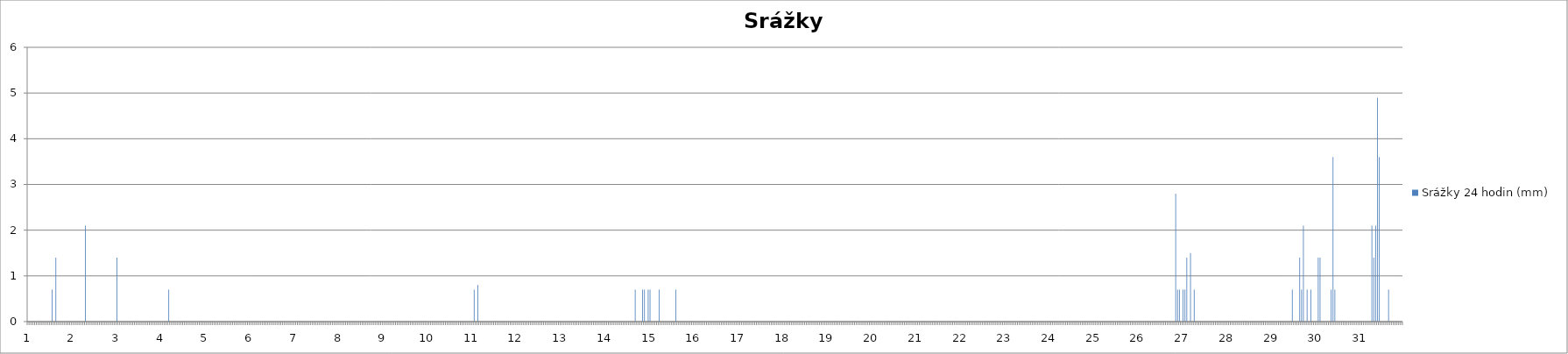
| Category | Srážky 24 hodin (mm) |
|---|---|
| 0 | 0 |
| 1 | 0 |
| 2 | 0 |
| 3 | 0 |
| 4 | 0 |
| 5 | 0 |
| 6 | 0 |
| 7 | 0 |
| 8 | 0 |
| 9 | 0 |
| 10 | 0 |
| 11 | 0 |
| 12 | 0 |
| 13 | 0.7 |
| 14 | 0 |
| 15 | 1.4 |
| 16 | 0 |
| 17 | 0 |
| 18 | 0 |
| 19 | 0 |
| 20 | 0 |
| 21 | 0 |
| 22 | 0 |
| 23 | 0 |
| 24 | 0 |
| 25 | 0 |
| 26 | 0 |
| 27 | 0 |
| 28 | 0 |
| 29 | 0 |
| 30 | 0 |
| 31 | 2.1 |
| 32 | 0 |
| 33 | 0 |
| 34 | 0 |
| 35 | 0 |
| 36 | 0 |
| 37 | 0 |
| 38 | 0 |
| 39 | 0 |
| 40 | 0 |
| 41 | 0 |
| 42 | 0 |
| 43 | 0 |
| 44 | 0 |
| 45 | 0 |
| 46 | 0 |
| 47 | 0 |
| 48 | 1.4 |
| 49 | 0 |
| 50 | 0 |
| 51 | 0 |
| 52 | 0 |
| 53 | 0 |
| 54 | 0 |
| 55 | 0 |
| 56 | 0 |
| 57 | 0 |
| 58 | 0 |
| 59 | 0 |
| 60 | 0 |
| 61 | 0 |
| 62 | 0 |
| 63 | 0 |
| 64 | 0 |
| 65 | 0 |
| 66 | 0 |
| 67 | 0 |
| 68 | 0 |
| 69 | 0 |
| 70 | 0 |
| 71 | 0 |
| 72 | 0 |
| 73 | 0 |
| 74 | 0 |
| 75 | 0 |
| 76 | 0.7 |
| 77 | 0 |
| 78 | 0 |
| 79 | 0 |
| 80 | 0 |
| 81 | 0 |
| 82 | 0 |
| 83 | 0 |
| 84 | 0 |
| 85 | 0 |
| 86 | 0 |
| 87 | 0 |
| 88 | 0 |
| 89 | 0 |
| 90 | 0 |
| 91 | 0 |
| 92 | 0 |
| 93 | 0 |
| 94 | 0 |
| 95 | 0 |
| 96 | 0 |
| 97 | 0 |
| 98 | 0 |
| 99 | 0 |
| 100 | 0 |
| 101 | 0 |
| 102 | 0 |
| 103 | 0 |
| 104 | 0 |
| 105 | 0 |
| 106 | 0 |
| 107 | 0 |
| 108 | 0 |
| 109 | 0 |
| 110 | 0 |
| 111 | 0 |
| 112 | 0 |
| 113 | 0 |
| 114 | 0 |
| 115 | 0 |
| 116 | 0 |
| 117 | 0 |
| 118 | 0 |
| 119 | 0 |
| 120 | 0 |
| 121 | 0 |
| 122 | 0 |
| 123 | 0 |
| 124 | 0 |
| 125 | 0 |
| 126 | 0 |
| 127 | 0 |
| 128 | 0 |
| 129 | 0 |
| 130 | 0 |
| 131 | 0 |
| 132 | 0 |
| 133 | 0 |
| 134 | 0 |
| 135 | 0 |
| 136 | 0 |
| 137 | 0 |
| 138 | 0 |
| 139 | 0 |
| 140 | 0 |
| 141 | 0 |
| 142 | 0 |
| 143 | 0 |
| 144 | 0 |
| 145 | 0 |
| 146 | 0 |
| 147 | 0 |
| 148 | 0 |
| 149 | 0 |
| 150 | 0 |
| 151 | 0 |
| 152 | 0 |
| 153 | 0 |
| 154 | 0 |
| 155 | 0 |
| 156 | 0 |
| 157 | 0 |
| 158 | 0 |
| 159 | 0 |
| 160 | 0 |
| 161 | 0 |
| 162 | 0 |
| 163 | 0 |
| 164 | 0 |
| 165 | 0 |
| 166 | 0 |
| 167 | 0 |
| 168 | 0 |
| 169 | 0 |
| 170 | 0 |
| 171 | 0 |
| 172 | 0 |
| 173 | 0 |
| 174 | 0 |
| 175 | 0 |
| 176 | 0 |
| 177 | 0 |
| 178 | 0 |
| 179 | 0 |
| 180 | 0 |
| 181 | 0 |
| 182 | 0 |
| 183 | 0 |
| 184 | 0 |
| 185 | 0 |
| 186 | 0 |
| 187 | 0 |
| 188 | 0 |
| 189 | 0 |
| 190 | 0 |
| 191 | 0 |
| 192 | 0 |
| 193 | 0 |
| 194 | 0 |
| 195 | 0 |
| 196 | 0 |
| 197 | 0 |
| 198 | 0 |
| 199 | 0 |
| 200 | 0 |
| 201 | 0 |
| 202 | 0 |
| 203 | 0 |
| 204 | 0 |
| 205 | 0 |
| 206 | 0 |
| 207 | 0 |
| 208 | 0 |
| 209 | 0 |
| 210 | 0 |
| 211 | 0 |
| 212 | 0 |
| 213 | 0 |
| 214 | 0 |
| 215 | 0 |
| 216 | 0 |
| 217 | 0 |
| 218 | 0 |
| 219 | 0 |
| 220 | 0 |
| 221 | 0 |
| 222 | 0 |
| 223 | 0 |
| 224 | 0 |
| 225 | 0 |
| 226 | 0 |
| 227 | 0 |
| 228 | 0 |
| 229 | 0 |
| 230 | 0 |
| 231 | 0 |
| 232 | 0 |
| 233 | 0 |
| 234 | 0 |
| 235 | 0 |
| 236 | 0 |
| 237 | 0 |
| 238 | 0 |
| 239 | 0 |
| 240 | 0 |
| 241 | 0.7 |
| 242 | 0 |
| 243 | 0.8 |
| 244 | 0 |
| 245 | 0 |
| 246 | 0 |
| 247 | 0 |
| 248 | 0 |
| 249 | 0 |
| 250 | 0 |
| 251 | 0 |
| 252 | 0 |
| 253 | 0 |
| 254 | 0 |
| 255 | 0 |
| 256 | 0 |
| 257 | 0 |
| 258 | 0 |
| 259 | 0 |
| 260 | 0 |
| 261 | 0 |
| 262 | 0 |
| 263 | 0 |
| 264 | 0 |
| 265 | 0 |
| 266 | 0 |
| 267 | 0 |
| 268 | 0 |
| 269 | 0 |
| 270 | 0 |
| 271 | 0 |
| 272 | 0 |
| 273 | 0 |
| 274 | 0 |
| 275 | 0 |
| 276 | 0 |
| 277 | 0 |
| 278 | 0 |
| 279 | 0 |
| 280 | 0 |
| 281 | 0 |
| 282 | 0 |
| 283 | 0 |
| 284 | 0 |
| 285 | 0 |
| 286 | 0 |
| 287 | 0 |
| 288 | 0 |
| 289 | 0 |
| 290 | 0 |
| 291 | 0 |
| 292 | 0 |
| 293 | 0 |
| 294 | 0 |
| 295 | 0 |
| 296 | 0 |
| 297 | 0 |
| 298 | 0 |
| 299 | 0 |
| 300 | 0 |
| 301 | 0 |
| 302 | 0 |
| 303 | 0 |
| 304 | 0 |
| 305 | 0 |
| 306 | 0 |
| 307 | 0 |
| 308 | 0 |
| 309 | 0 |
| 310 | 0 |
| 311 | 0 |
| 312 | 0 |
| 313 | 0 |
| 314 | 0 |
| 315 | 0 |
| 316 | 0 |
| 317 | 0 |
| 318 | 0 |
| 319 | 0 |
| 320 | 0 |
| 321 | 0 |
| 322 | 0 |
| 323 | 0 |
| 324 | 0 |
| 325 | 0 |
| 326 | 0 |
| 327 | 0 |
| 328 | 0.7 |
| 329 | 0 |
| 330 | 0 |
| 331 | 0 |
| 332 | 0.7 |
| 333 | 0.7 |
| 334 | 0 |
| 335 | 0.7 |
| 336 | 0.7 |
| 337 | 0 |
| 338 | 0 |
| 339 | 0 |
| 340 | 0 |
| 341 | 0.7 |
| 342 | 0 |
| 343 | 0 |
| 344 | 0 |
| 345 | 0 |
| 346 | 0 |
| 347 | 0 |
| 348 | 0 |
| 349 | 0 |
| 350 | 0.7 |
| 351 | 0 |
| 352 | 0 |
| 353 | 0 |
| 354 | 0 |
| 355 | 0 |
| 356 | 0 |
| 357 | 0 |
| 358 | 0 |
| 359 | 0 |
| 360 | 0 |
| 361 | 0 |
| 362 | 0 |
| 363 | 0 |
| 364 | 0 |
| 365 | 0 |
| 366 | 0 |
| 367 | 0 |
| 368 | 0 |
| 369 | 0 |
| 370 | 0 |
| 371 | 0 |
| 372 | 0 |
| 373 | 0 |
| 374 | 0 |
| 375 | 0 |
| 376 | 0 |
| 377 | 0 |
| 378 | 0 |
| 379 | 0 |
| 380 | 0 |
| 381 | 0 |
| 382 | 0 |
| 383 | 0 |
| 384 | 0 |
| 385 | 0 |
| 386 | 0 |
| 387 | 0 |
| 388 | 0 |
| 389 | 0 |
| 390 | 0 |
| 391 | 0 |
| 392 | 0 |
| 393 | 0 |
| 394 | 0 |
| 395 | 0 |
| 396 | 0 |
| 397 | 0 |
| 398 | 0 |
| 399 | 0 |
| 400 | 0 |
| 401 | 0 |
| 402 | 0 |
| 403 | 0 |
| 404 | 0 |
| 405 | 0 |
| 406 | 0 |
| 407 | 0 |
| 408 | 0 |
| 409 | 0 |
| 410 | 0 |
| 411 | 0 |
| 412 | 0 |
| 413 | 0 |
| 414 | 0 |
| 415 | 0 |
| 416 | 0 |
| 417 | 0 |
| 418 | 0 |
| 419 | 0 |
| 420 | 0 |
| 421 | 0 |
| 422 | 0 |
| 423 | 0 |
| 424 | 0 |
| 425 | 0 |
| 426 | 0 |
| 427 | 0 |
| 428 | 0 |
| 429 | 0 |
| 430 | 0 |
| 431 | 0 |
| 432 | 0 |
| 433 | 0 |
| 434 | 0 |
| 435 | 0 |
| 436 | 0 |
| 437 | 0 |
| 438 | 0 |
| 439 | 0 |
| 440 | 0 |
| 441 | 0 |
| 442 | 0 |
| 443 | 0 |
| 444 | 0 |
| 445 | 0 |
| 446 | 0 |
| 447 | 0 |
| 448 | 0 |
| 449 | 0 |
| 450 | 0 |
| 451 | 0 |
| 452 | 0 |
| 453 | 0 |
| 454 | 0 |
| 455 | 0 |
| 456 | 0 |
| 457 | 0 |
| 458 | 0 |
| 459 | 0 |
| 460 | 0 |
| 461 | 0 |
| 462 | 0 |
| 463 | 0 |
| 464 | 0 |
| 465 | 0 |
| 466 | 0 |
| 467 | 0 |
| 468 | 0 |
| 469 | 0 |
| 470 | 0 |
| 471 | 0 |
| 472 | 0 |
| 473 | 0 |
| 474 | 0 |
| 475 | 0 |
| 476 | 0 |
| 477 | 0 |
| 478 | 0 |
| 479 | 0 |
| 480 | 0 |
| 481 | 0 |
| 482 | 0 |
| 483 | 0 |
| 484 | 0 |
| 485 | 0 |
| 486 | 0 |
| 487 | 0 |
| 488 | 0 |
| 489 | 0 |
| 490 | 0 |
| 491 | 0 |
| 492 | 0 |
| 493 | 0 |
| 494 | 0 |
| 495 | 0 |
| 496 | 0 |
| 497 | 0 |
| 498 | 0 |
| 499 | 0 |
| 500 | 0 |
| 501 | 0 |
| 502 | 0 |
| 503 | 0 |
| 504 | 0 |
| 505 | 0 |
| 506 | 0 |
| 507 | 0 |
| 508 | 0 |
| 509 | 0 |
| 510 | 0 |
| 511 | 0 |
| 512 | 0 |
| 513 | 0 |
| 514 | 0 |
| 515 | 0 |
| 516 | 0 |
| 517 | 0 |
| 518 | 0 |
| 519 | 0 |
| 520 | 0 |
| 521 | 0 |
| 522 | 0 |
| 523 | 0 |
| 524 | 0 |
| 525 | 0 |
| 526 | 0 |
| 527 | 0 |
| 528 | 0 |
| 529 | 0 |
| 530 | 0 |
| 531 | 0 |
| 532 | 0 |
| 533 | 0 |
| 534 | 0 |
| 535 | 0 |
| 536 | 0 |
| 537 | 0 |
| 538 | 0 |
| 539 | 0 |
| 540 | 0 |
| 541 | 0 |
| 542 | 0 |
| 543 | 0 |
| 544 | 0 |
| 545 | 0 |
| 546 | 0 |
| 547 | 0 |
| 548 | 0 |
| 549 | 0 |
| 550 | 0 |
| 551 | 0 |
| 552 | 0 |
| 553 | 0 |
| 554 | 0 |
| 555 | 0 |
| 556 | 0 |
| 557 | 0 |
| 558 | 0 |
| 559 | 0 |
| 560 | 0 |
| 561 | 0 |
| 562 | 0 |
| 563 | 0 |
| 564 | 0 |
| 565 | 0 |
| 566 | 0 |
| 567 | 0 |
| 568 | 0 |
| 569 | 0 |
| 570 | 0 |
| 571 | 0 |
| 572 | 0 |
| 573 | 0 |
| 574 | 0 |
| 575 | 0 |
| 576 | 0 |
| 577 | 0 |
| 578 | 0 |
| 579 | 0 |
| 580 | 0 |
| 581 | 0 |
| 582 | 0 |
| 583 | 0 |
| 584 | 0 |
| 585 | 0 |
| 586 | 0 |
| 587 | 0 |
| 588 | 0 |
| 589 | 0 |
| 590 | 0 |
| 591 | 0 |
| 592 | 0 |
| 593 | 0 |
| 594 | 0 |
| 595 | 0 |
| 596 | 0 |
| 597 | 0 |
| 598 | 0 |
| 599 | 0 |
| 600 | 0 |
| 601 | 0 |
| 602 | 0 |
| 603 | 0 |
| 604 | 0 |
| 605 | 0 |
| 606 | 0 |
| 607 | 0 |
| 608 | 0 |
| 609 | 0 |
| 610 | 0 |
| 611 | 0 |
| 612 | 0 |
| 613 | 0 |
| 614 | 0 |
| 615 | 0 |
| 616 | 0 |
| 617 | 0 |
| 618 | 0 |
| 619 | 0 |
| 620 | 2.8 |
| 621 | 0.7 |
| 622 | 0.7 |
| 623 | 0 |
| 624 | 0.7 |
| 625 | 0.7 |
| 626 | 1.4 |
| 627 | 0 |
| 628 | 1.5 |
| 629 | 0 |
| 630 | 0.7 |
| 631 | 0 |
| 632 | 0 |
| 633 | 0 |
| 634 | 0 |
| 635 | 0 |
| 636 | 0 |
| 637 | 0 |
| 638 | 0 |
| 639 | 0 |
| 640 | 0 |
| 641 | 0 |
| 642 | 0 |
| 643 | 0 |
| 644 | 0 |
| 645 | 0 |
| 646 | 0 |
| 647 | 0 |
| 648 | 0 |
| 649 | 0 |
| 650 | 0 |
| 651 | 0 |
| 652 | 0 |
| 653 | 0 |
| 654 | 0 |
| 655 | 0 |
| 656 | 0 |
| 657 | 0 |
| 658 | 0 |
| 659 | 0 |
| 660 | 0 |
| 661 | 0 |
| 662 | 0 |
| 663 | 0 |
| 664 | 0 |
| 665 | 0 |
| 666 | 0 |
| 667 | 0 |
| 668 | 0 |
| 669 | 0 |
| 670 | 0 |
| 671 | 0 |
| 672 | 0 |
| 673 | 0 |
| 674 | 0 |
| 675 | 0 |
| 676 | 0 |
| 677 | 0 |
| 678 | 0 |
| 679 | 0 |
| 680 | 0 |
| 681 | 0 |
| 682 | 0 |
| 683 | 0.7 |
| 684 | 0 |
| 685 | 0 |
| 686 | 0 |
| 687 | 1.4 |
| 688 | 0.7 |
| 689 | 2.1 |
| 690 | 0 |
| 691 | 0.7 |
| 692 | 0 |
| 693 | 0.7 |
| 694 | 0 |
| 695 | 0 |
| 696 | 0 |
| 697 | 1.4 |
| 698 | 1.4 |
| 699 | 0 |
| 700 | 0 |
| 701 | 0 |
| 702 | 0 |
| 703 | 0 |
| 704 | 0.7 |
| 705 | 3.6 |
| 706 | 0.7 |
| 707 | 0 |
| 708 | 0 |
| 709 | 0 |
| 710 | 0 |
| 711 | 0 |
| 712 | 0 |
| 713 | 0 |
| 714 | 0 |
| 715 | 0 |
| 716 | 0 |
| 717 | 0 |
| 718 | 0 |
| 719 | 0 |
| 720 | 0 |
| 721 | 0 |
| 722 | 0 |
| 723 | 0 |
| 724 | 0 |
| 725 | 0 |
| 726 | 2.1 |
| 727 | 1.4 |
| 728 | 2.1 |
| 729 | 4.9 |
| 730 | 3.6 |
| 731 | 0 |
| 732 | 0 |
| 733 | 0 |
| 734 | 0 |
| 735 | 0.7 |
| 736 | 0 |
| 737 | 0 |
| 738 | 0 |
| 739 | 0 |
| 740 | 0 |
| 741 | 0 |
| 742 | 0 |